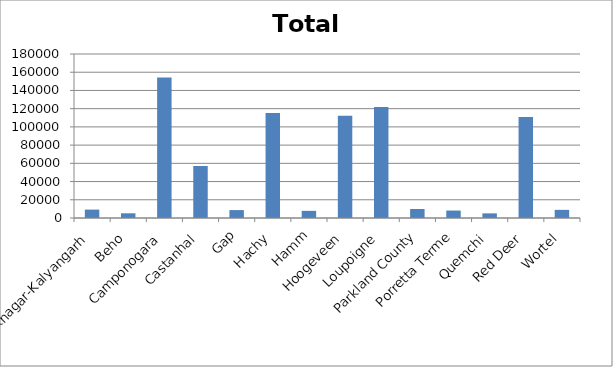
| Category | Total |
|---|---|
| Ashoknagar-Kalyangarh | 9223 |
| Beho | 5157 |
| Camponogara | 154320 |
| Castanhal | 57070 |
| Gap | 8695 |
| Hachy | 115121 |
| Hamm | 7844 |
| Hoogeveen | 112098 |
| Loupoigne | 121794 |
| Parkland County | 9910 |
| Porretta Terme | 8180 |
| Quemchi | 5088 |
| Red Deer | 110850 |
| Wortel | 8939 |